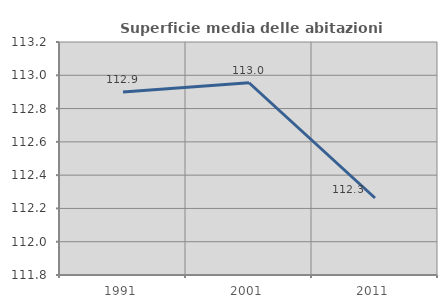
| Category | Superficie media delle abitazioni occupate |
|---|---|
| 1991.0 | 112.9 |
| 2001.0 | 112.955 |
| 2011.0 | 112.263 |